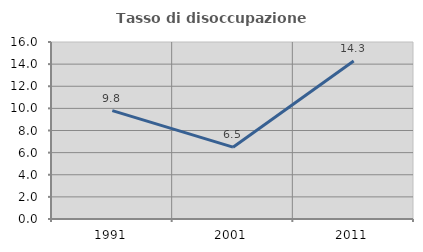
| Category | Tasso di disoccupazione giovanile  |
|---|---|
| 1991.0 | 9.794 |
| 2001.0 | 6.494 |
| 2011.0 | 14.286 |